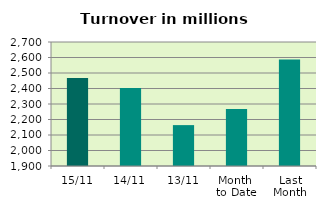
| Category | Series 0 |
|---|---|
| 15/11 | 2468.422 |
| 14/11 | 2403.288 |
| 13/11 | 2163.785 |
| Month 
to Date | 2267.886 |
| Last
Month | 2586.958 |